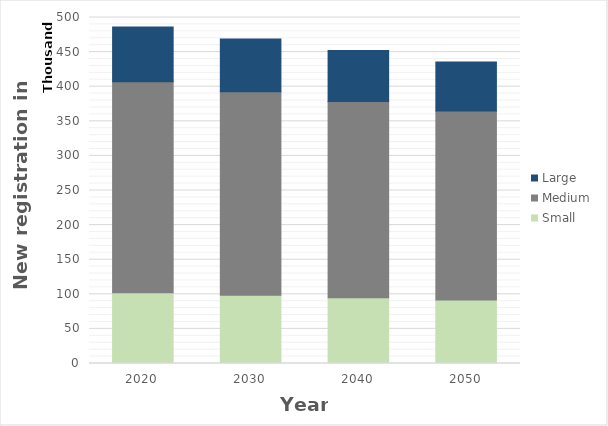
| Category | Small | Medium | Large |
|---|---|---|---|
| 2020.0 | 102325 | 304898 | 79122 |
| 2030.0 | 98699 | 294093 | 76317 |
| 2040.0 | 95141 | 283491 | 73566 |
| 2050.0 | 91647 | 273076 | 70863 |